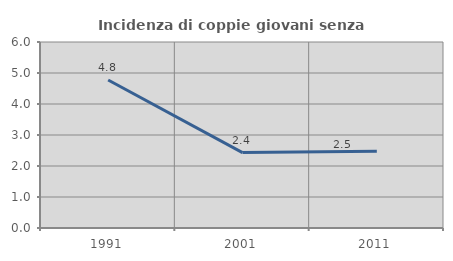
| Category | Incidenza di coppie giovani senza figli |
|---|---|
| 1991.0 | 4.773 |
| 2001.0 | 2.433 |
| 2011.0 | 2.475 |